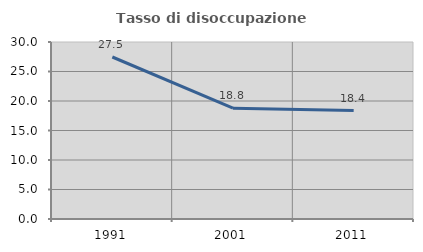
| Category | Tasso di disoccupazione giovanile  |
|---|---|
| 1991.0 | 27.457 |
| 2001.0 | 18.785 |
| 2011.0 | 18.382 |